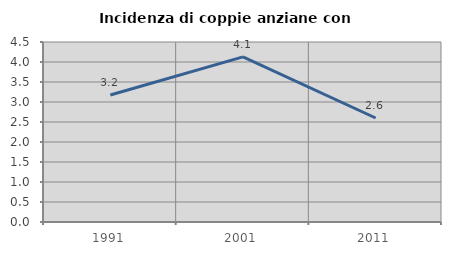
| Category | Incidenza di coppie anziane con figli |
|---|---|
| 1991.0 | 3.175 |
| 2001.0 | 4.128 |
| 2011.0 | 2.6 |